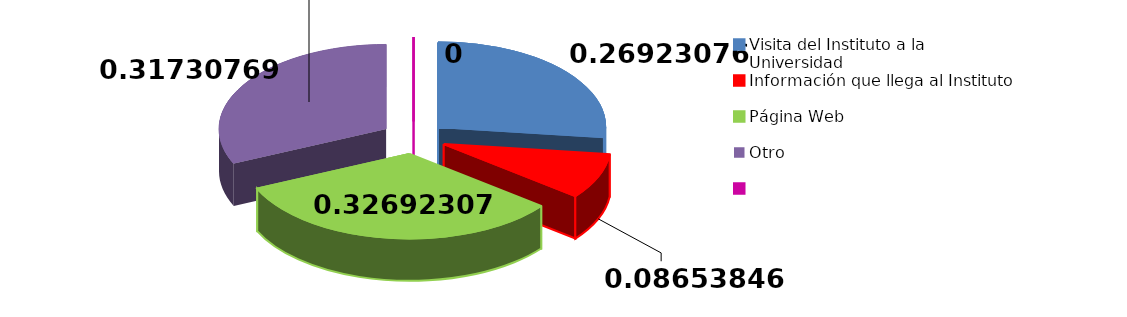
| Category | Series 0 | Series 1 |
|---|---|---|
| Visita del Instituto a la Universidad | 28 | 96 |
| Información que llega al Instituto | 9 | 97 |
| Página Web | 34 | 98 |
| Otro | 33 | 99 |